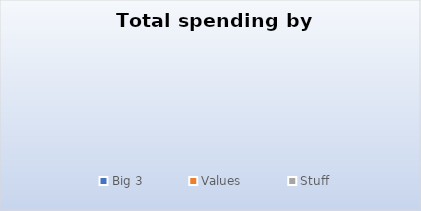
| Category | Series 0 |
|---|---|
| Big 3 | 0 |
| Values | 0 |
| Stuff | 0 |